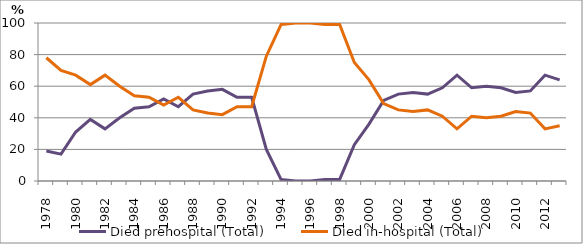
| Category | Died prehospital (Total) | Died in-hospital (Total) |
|---|---|---|
| 1978.0 | 19 | 78 |
| 1979.0 | 17 | 70 |
| 1980.0 | 31 | 67 |
| 1981.0 | 39 | 61 |
| 1982.0 | 33 | 67 |
| 1983.0 | 40 | 60 |
| 1984.0 | 46 | 54 |
| 1985.0 | 47 | 53 |
| 1986.0 | 52 | 48 |
| 1987.0 | 47 | 53 |
| 1988.0 | 55 | 45 |
| 1989.0 | 57 | 43 |
| 1990.0 | 58 | 42 |
| 1991.0 | 53 | 47 |
| 1992.0 | 53 | 47 |
| 1993.0 | 20 | 79 |
| 1994.0 | 1 | 99 |
| 1995.0 | 0 | 100 |
| 1996.0 | 0 | 100 |
| 1997.0 | 1 | 99 |
| 1998.0 | 1 | 99 |
| 1999.0 | 23 | 75 |
| 2000.0 | 36 | 64 |
| 2001.0 | 51 | 49 |
| 2002.0 | 55 | 45 |
| 2003.0 | 56 | 44 |
| 2004.0 | 55 | 45 |
| 2005.0 | 59 | 41 |
| 2006.0 | 67 | 33 |
| 2007.0 | 59 | 41 |
| 2008.0 | 60 | 40 |
| 2009.0 | 59 | 41 |
| 2010.0 | 56 | 44 |
| 2011.0 | 57 | 43 |
| 2012.0 | 67 | 33 |
| 2013.0 | 64 | 35 |